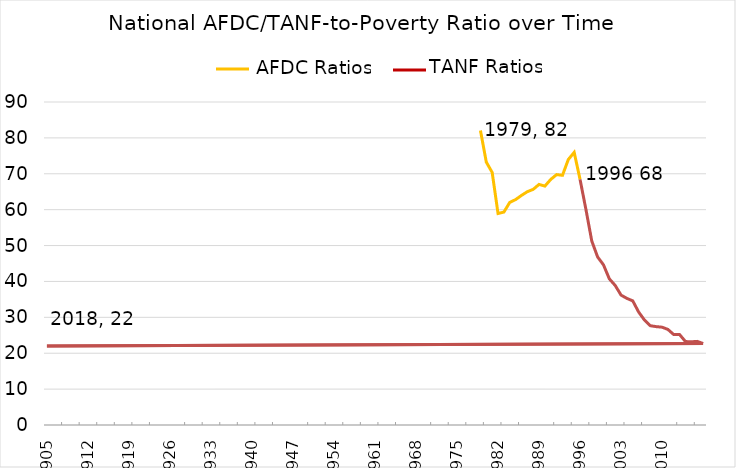
| Category | Series 0 |
|---|---|
| 1979-01-01 | 82.061 |
| 1980-01-01 | 73.245 |
| 1981-01-01 | 70.38 |
| 1982-01-01 | 58.928 |
| 1983-01-01 | 59.329 |
| 1984-01-01 | 62.017 |
| 1985-01-01 | 62.807 |
| 1986-01-01 | 63.968 |
| 1987-01-01 | 65.007 |
| 1988-01-01 | 65.658 |
| 1989-01-01 | 67.032 |
| 1990-01-01 | 66.57 |
| 1991-01-01 | 68.428 |
| 1992-01-01 | 69.77 |
| 1993-01-01 | 69.573 |
| 1994-01-01 | 73.982 |
| 1995-01-01 | 75.967 |
| 1996-01-01 | 68.434 |
| 1997-01-01 | 60.107 |
| 1998-01-01 | 51.281 |
| 1999-01-01 | 46.815 |
| 2000-01-01 | 44.625 |
| 2001-01-01 | 40.721 |
| 2002-01-01 | 38.883 |
| 2003-01-01 | 36.191 |
| 2004-01-01 | 35.279 |
| 2005-01-01 | 34.584 |
| 2006-01-01 | 31.487 |
| 2007-01-01 | 29.231 |
| 2008-01-01 | 27.663 |
| 2009-01-01 | 27.409 |
| 2010-01-01 | 27.258 |
| 2011-01-01 | 26.626 |
| 2012-01-01 | 25.192 |
| 2013-01-01 | 25.183 |
| 2014-01-01 | 23.248 |
| 2015-01-01 | 23.188 |
| 2016-01-01 | 23.299 |
| 2017-01-01 | 22.708 |
| 1905-07-10 | 22 |